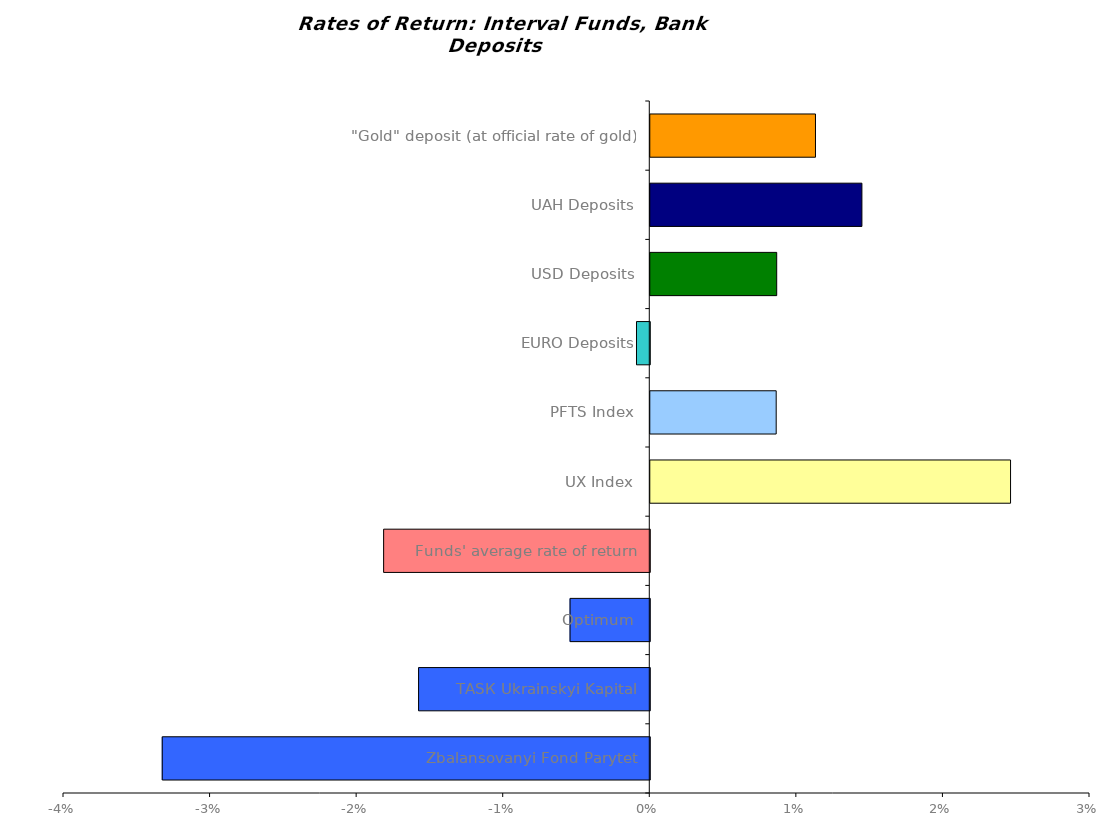
| Category | Series 0 |
|---|---|
| Zbalansovanyi Fond Parytet | -0.033 |
| ТАSК Ukrainskyi Kapital | -0.016 |
| Оptimum | -0.005 |
| Funds' average rate of return | -0.018 |
| UX Index | 0.025 |
| PFTS Index | 0.009 |
| EURO Deposits | -0.001 |
| USD Deposits | 0.009 |
| UAH Deposits | 0.014 |
| "Gold" deposit (at official rate of gold) | 0.011 |